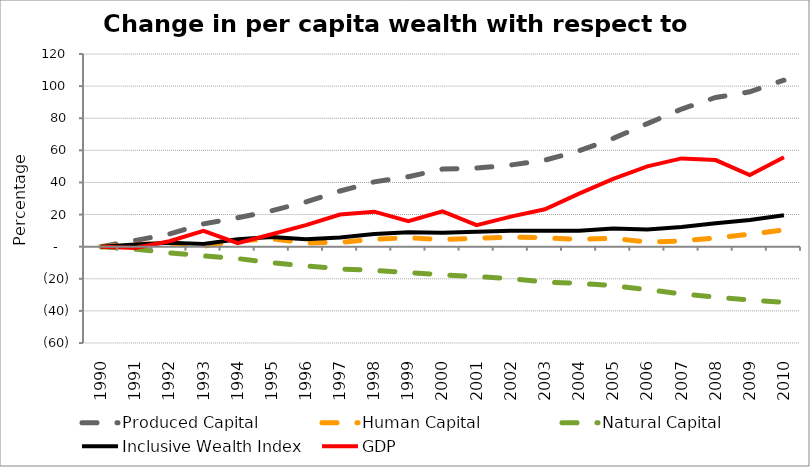
| Category | Produced Capital  | Human Capital | Natural Capital | Inclusive Wealth Index | GDP |
|---|---|---|---|---|---|
| 1990.0 | 0 | 0 | 0 | 0 | 0 |
| 1991.0 | 3.84 | 1.316 | -1.584 | 1.398 | -0.794 |
| 1992.0 | 7.916 | 2.16 | -3.817 | 2.409 | 3.372 |
| 1993.0 | 14.187 | 0.261 | -5.757 | 1.698 | 9.827 |
| 1994.0 | 17.995 | 3.539 | -7.393 | 4.567 | 2.13 |
| 1995.0 | 22.367 | 4.933 | -10.013 | 5.999 | 7.701 |
| 1996.0 | 27.856 | 2.314 | -11.959 | 4.63 | 13.402 |
| 1997.0 | 34.661 | 2.7 | -13.857 | 5.726 | 20.011 |
| 1998.0 | 40.38 | 4.593 | -14.843 | 7.893 | 21.799 |
| 1999.0 | 43.544 | 5.534 | -16.1 | 8.941 | 15.917 |
| 2000.0 | 48.302 | 4.415 | -17.499 | 8.652 | 21.95 |
| 2001.0 | 48.994 | 5.241 | -18.63 | 9.265 | 13.368 |
| 2002.0 | 50.844 | 5.948 | -19.949 | 9.938 | 18.698 |
| 2003.0 | 53.875 | 5.513 | -22.004 | 9.848 | 23.266 |
| 2004.0 | 59.701 | 4.501 | -22.864 | 9.849 | 33.009 |
| 2005.0 | 67.43 | 5.193 | -24.316 | 11.356 | 42.265 |
| 2006.0 | 76.647 | 2.81 | -26.736 | 10.661 | 50.045 |
| 2007.0 | 85.699 | 3.575 | -29.394 | 12.297 | 54.965 |
| 2008.0 | 92.943 | 5.443 | -31.417 | 14.564 | 53.939 |
| 2009.0 | 96.442 | 7.79 | -33.218 | 16.67 | 44.629 |
| 2010.0 | 103.682 | 10.39 | -34.646 | 19.548 | 55.69 |